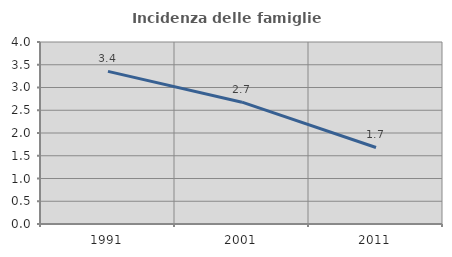
| Category | Incidenza delle famiglie numerose |
|---|---|
| 1991.0 | 3.355 |
| 2001.0 | 2.677 |
| 2011.0 | 1.682 |